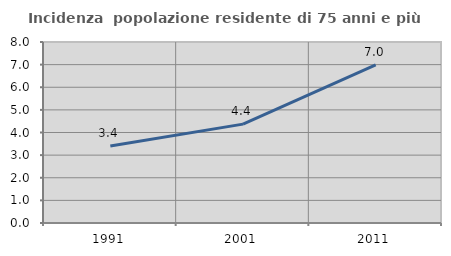
| Category | Incidenza  popolazione residente di 75 anni e più |
|---|---|
| 1991.0 | 3.401 |
| 2001.0 | 4.371 |
| 2011.0 | 6.985 |